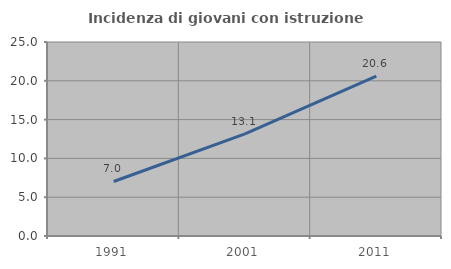
| Category | Incidenza di giovani con istruzione universitaria |
|---|---|
| 1991.0 | 7.023 |
| 2001.0 | 13.15 |
| 2011.0 | 20.588 |